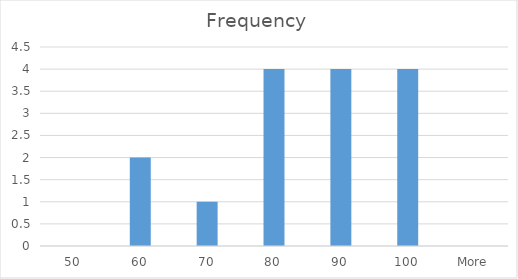
| Category | Frequency |
|---|---|
| 50 | 0 |
| 60 | 2 |
| 70 | 1 |
| 80 | 4 |
| 90 | 4 |
| 100 | 4 |
| More | 0 |